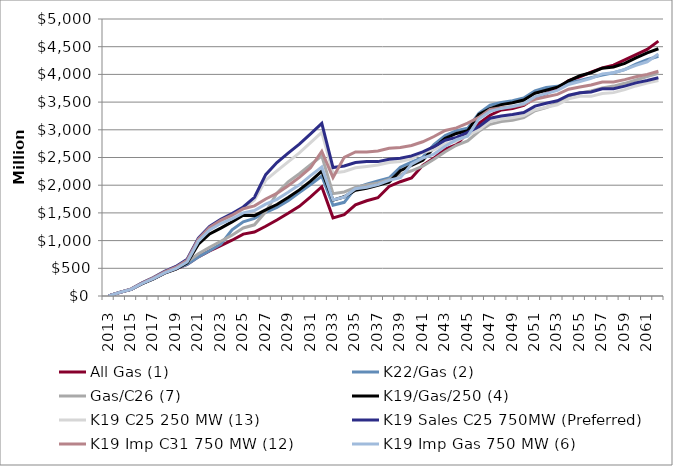
| Category | All Gas (1) | K22/Gas (2) | Gas/C26 (7) | K19/Gas/250 (4) | K19 C25 250 MW (13) | K19 Sales C25 750MW (Preferred) | K19 Imp C31 750 MW (12) | K19 Imp Gas 750 MW (6) |
|---|---|---|---|---|---|---|---|---|
| 2013.0 | 0 | 0 | 0 | 0 | 0 | 0 | 0 | 0 |
| 2014.0 | 66 | 66 | 66 | 66 | 66 | 66 | 66 | 66 |
| 2015.0 | 119 | 119 | 125 | 118 | 126 | 124 | 123 | 119 |
| 2016.0 | 226 | 228 | 239 | 224 | 240 | 237 | 235 | 226 |
| 2017.0 | 312 | 315 | 332 | 310 | 336 | 333 | 327 | 313 |
| 2018.0 | 418 | 422 | 447 | 412 | 449 | 446 | 437 | 418 |
| 2019.0 | 490 | 493 | 526 | 484 | 531 | 534 | 520 | 494 |
| 2020.0 | 568 | 572 | 613 | 597 | 656 | 662 | 645 | 613 |
| 2021.0 | 707 | 706 | 763 | 936 | 1009 | 1043 | 1028 | 988 |
| 2022.0 | 814 | 817 | 881 | 1120 | 1207 | 1257 | 1239 | 1191 |
| 2023.0 | 909 | 936 | 989 | 1226 | 1324 | 1386 | 1364 | 1308 |
| 2024.0 | 1007 | 1194 | 1098 | 1338 | 1444 | 1489 | 1458 | 1393 |
| 2025.0 | 1118 | 1339 | 1228 | 1457 | 1576 | 1607 | 1575 | 1500 |
| 2026.0 | 1154 | 1400 | 1285 | 1451 | 1735 | 1782 | 1627 | 1542 |
| 2027.0 | 1259 | 1511 | 1519 | 1554 | 2090 | 2190 | 1752 | 1657 |
| 2028.0 | 1372 | 1600 | 1857 | 1651 | 2257 | 2408 | 1852 | 1745 |
| 2029.0 | 1492 | 1721 | 2061 | 1776 | 2420 | 2578 | 1989 | 1872 |
| 2030.0 | 1619 | 1867 | 2206 | 1915 | 2583 | 2741 | 2141 | 2006 |
| 2031.0 | 1789 | 2013 | 2369 | 2072 | 2767 | 2926 | 2315 | 2172 |
| 2032.0 | 1972 | 2165 | 2531 | 2256 | 2954 | 3116 | 2613 | 2327 |
| 2033.0 | 1411 | 1637 | 1848 | 1730 | 2219 | 2318 | 2139 | 1733 |
| 2034.0 | 1468 | 1691 | 1878 | 1791 | 2248 | 2348 | 2502 | 1787 |
| 2035.0 | 1647 | 1948 | 1960 | 1910 | 2315 | 2408 | 2601 | 1936 |
| 2036.0 | 1719 | 2017 | 2003 | 1944 | 2338 | 2429 | 2599 | 1964 |
| 2037.0 | 1774 | 2078 | 2042 | 1998 | 2364 | 2426 | 2618 | 2010 |
| 2038.0 | 1977 | 2129 | 2106 | 2056 | 2409 | 2469 | 2665 | 2089 |
| 2039.0 | 2063 | 2326 | 2195 | 2263 | 2429 | 2488 | 2682 | 2137 |
| 2040.0 | 2131 | 2416 | 2260 | 2357 | 2474 | 2529 | 2718 | 2379 |
| 2041.0 | 2359 | 2503 | 2345 | 2448 | 2591 | 2600 | 2784 | 2488 |
| 2042.0 | 2489 | 2732 | 2469 | 2681 | 2642 | 2697 | 2879 | 2562 |
| 2043.0 | 2653 | 2898 | 2604 | 2846 | 2747 | 2811 | 2988 | 2702 |
| 2044.0 | 2730 | 2985 | 2720 | 2934 | 2797 | 2862 | 3035 | 2823 |
| 2045.0 | 2946 | 3027 | 2798 | 2982 | 2899 | 2953 | 3122 | 2885 |
| 2046.0 | 3114 | 3297 | 2973 | 3277 | 2995 | 3056 | 3224 | 3195 |
| 2047.0 | 3264 | 3443 | 3099 | 3381 | 3151 | 3209 | 3369 | 3332 |
| 2048.0 | 3358 | 3494 | 3151 | 3455 | 3193 | 3250 | 3398 | 3386 |
| 2049.0 | 3386 | 3523 | 3171 | 3487 | 3218 | 3275 | 3416 | 3420 |
| 2050.0 | 3440 | 3574 | 3220 | 3537 | 3257 | 3311 | 3454 | 3471 |
| 2051.0 | 3575 | 3701 | 3343 | 3660 | 3363 | 3427 | 3551 | 3599 |
| 2052.0 | 3652 | 3764 | 3403 | 3715 | 3408 | 3479 | 3598 | 3653 |
| 2053.0 | 3746 | 3785 | 3482 | 3769 | 3452 | 3523 | 3640 | 3711 |
| 2054.0 | 3886 | 3852 | 3609 | 3885 | 3558 | 3624 | 3733 | 3819 |
| 2055.0 | 3955 | 3890 | 3663 | 3975 | 3606 | 3667 | 3772 | 3869 |
| 2056.0 | 4039 | 3941 | 3701 | 4030 | 3604 | 3683 | 3808 | 3928 |
| 2057.0 | 4118 | 3989 | 3755 | 4113 | 3656 | 3741 | 3863 | 4010 |
| 2058.0 | 4167 | 4031 | 3789 | 4135 | 3671 | 3741 | 3865 | 4031 |
| 2059.0 | 4264 | 4086 | 3839 | 4198 | 3726 | 3788 | 3906 | 4089 |
| 2060.0 | 4356 | 4187 | 3899 | 4299 | 3792 | 3847 | 3958 | 4163 |
| 2061.0 | 4452 | 4264 | 3960 | 4387 | 3843 | 3889 | 4000 | 4228 |
| 2062.0 | 4600 | 4328 | 4021 | 4463 | 3890 | 3939 | 4056 | 4368 |